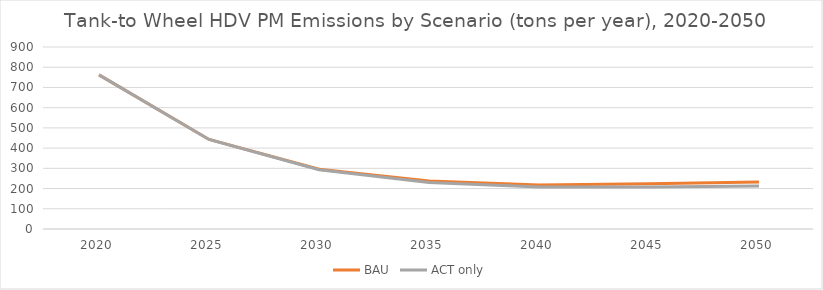
| Category | BAU | ACT only |
|---|---|---|
| 2020.0 | 762.35 | 762.35 |
| 2025.0 | 442.798 | 442.798 |
| 2030.0 | 295.423 | 293.357 |
| 2035.0 | 237.307 | 230.286 |
| 2040.0 | 217.941 | 207.366 |
| 2045.0 | 223.646 | 208.188 |
| 2050.0 | 232.761 | 213.05 |